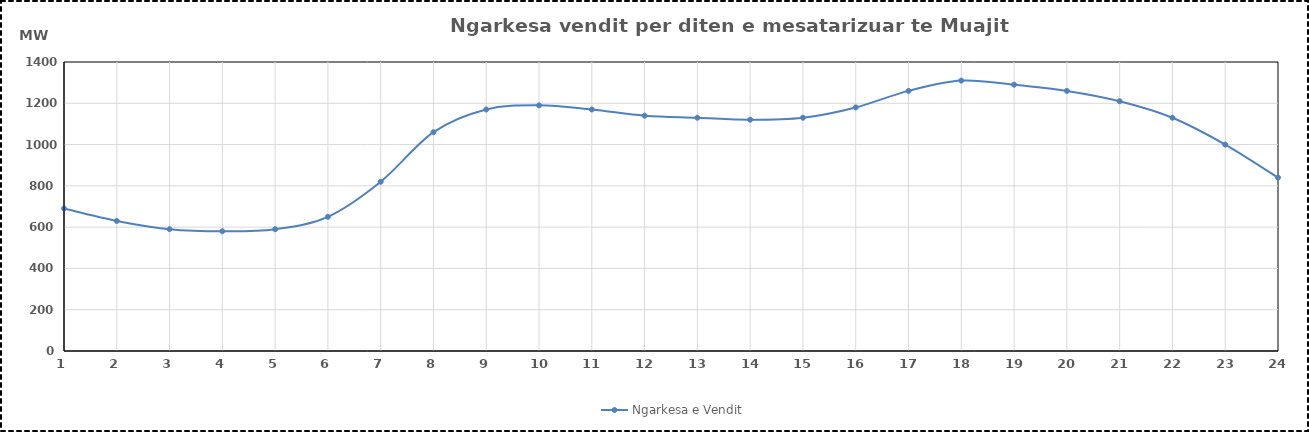
| Category | Ngarkesa e Vendit |
|---|---|
| 1.0 | 690 |
| 2.0 | 630 |
| 3.0 | 590 |
| 4.0 | 580 |
| 5.0 | 590 |
| 6.0 | 650 |
| 7.0 | 820 |
| 8.0 | 1060 |
| 9.0 | 1170 |
| 10.0 | 1190 |
| 11.0 | 1170 |
| 12.0 | 1140 |
| 13.0 | 1130 |
| 14.0 | 1120.35 |
| 15.0 | 1130 |
| 16.0 | 1180 |
| 17.0 | 1260 |
| 18.0 | 1310 |
| 19.0 | 1290 |
| 20.0 | 1260 |
| 21.0 | 1210 |
| 22.0 | 1130 |
| 23.0 | 1000 |
| 24.0 | 840 |